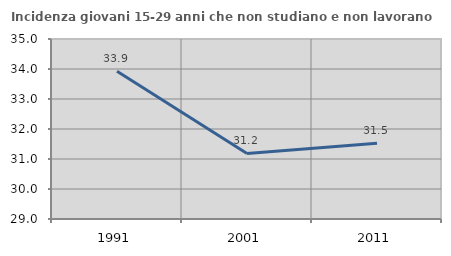
| Category | Incidenza giovani 15-29 anni che non studiano e non lavorano  |
|---|---|
| 1991.0 | 33.924 |
| 2001.0 | 31.184 |
| 2011.0 | 31.525 |